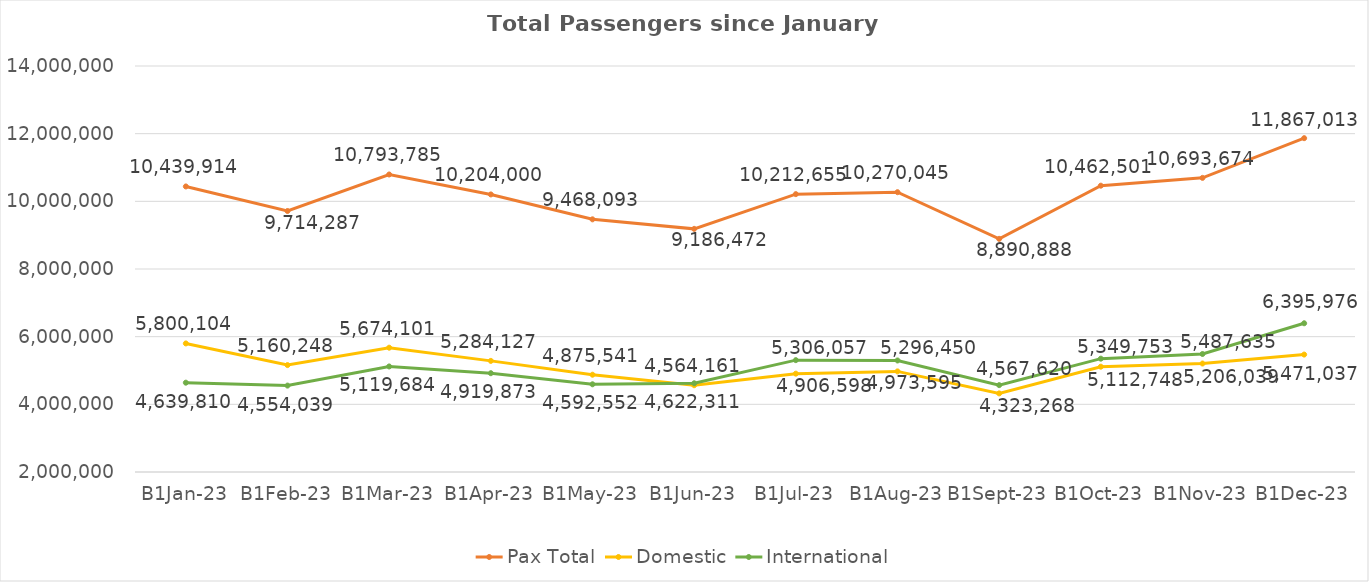
| Category | Pax Total | Domestic | International |
|---|---|---|---|
| 2023-01-01 | 10439914 | 5800104 | 4639810 |
| 2023-02-01 | 9714287 | 5160248 | 4554039 |
| 2023-03-01 | 10793785 | 5674101 | 5119684 |
| 2023-04-01 | 10204000 | 5284127 | 4919873 |
| 2023-05-01 | 9468093 | 4875541 | 4592552 |
| 2023-06-01 | 9186472 | 4564161 | 4622311 |
| 2023-07-01 | 10212655 | 4906598 | 5306057 |
| 2023-08-01 | 10270045 | 4973595 | 5296450 |
| 2023-09-01 | 8890888 | 4323268 | 4567620 |
| 2023-10-01 | 10462501 | 5112748 | 5349753 |
| 2023-11-01 | 10693674 | 5206039 | 5487635 |
| 2023-12-01 | 11867013 | 5471037 | 6395976 |